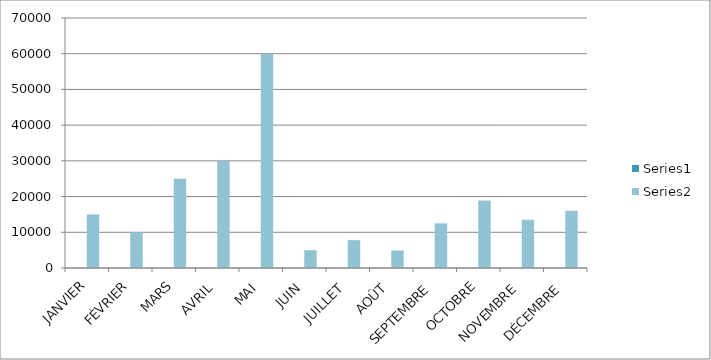
| Category | Series 0 | Series 1 |
|---|---|---|
| JANVIER |  | 15000 |
| FÉVRIER |  | 10000 |
| MARS |  | 25000 |
| AVRIL |  | 30000 |
| MAI |  | 60000 |
| JUIN |  | 5000 |
| JUILLET |  | 7800 |
| AOÛT |  | 4900 |
| SEPTEMBRE |  | 12500 |
| OCTOBRE |  | 18900 |
| NOVEMBRE |  | 13500 |
| DÉCEMBRE |  | 16000 |